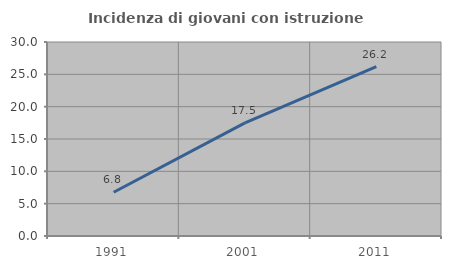
| Category | Incidenza di giovani con istruzione universitaria |
|---|---|
| 1991.0 | 6.771 |
| 2001.0 | 17.5 |
| 2011.0 | 26.174 |